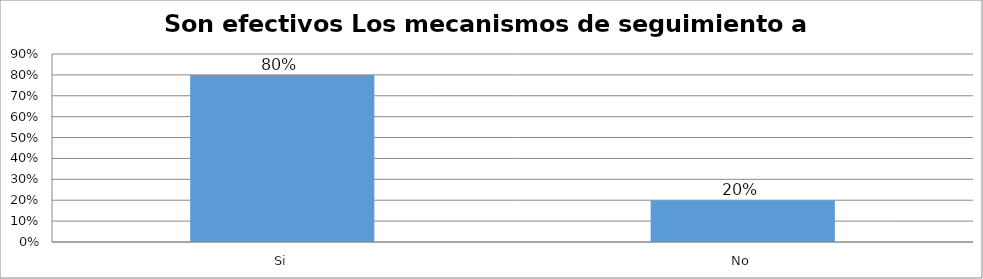
| Category | Series 0 |
|---|---|
| Si | 0.8 |
| No | 0.2 |